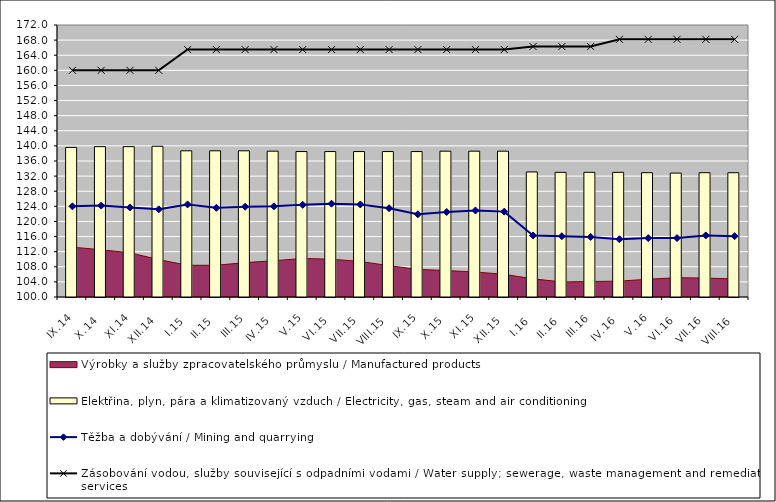
| Category | Elektřina, plyn, pára a klimatizovaný vzduch / Electricity, gas, steam and air conditioning |
|---|---|
| IX.14 | 139.6 |
| X.14 | 139.8 |
| XI.14 | 139.8 |
| XII.14 | 139.9 |
| I.15 | 138.7 |
| II.15 | 138.7 |
| III.15 | 138.7 |
| IV.15 | 138.6 |
| V.15 | 138.5 |
| VI.15 | 138.5 |
| VII.15 | 138.5 |
| VIII.15 | 138.5 |
| IX.15 | 138.5 |
| X.15 | 138.6 |
| XI.15 | 138.6 |
| XII.15 | 138.6 |
| I.16 | 133.1 |
| II.16 | 133 |
| III.16 | 133 |
| IV.16 | 133 |
| V.16 | 132.9 |
| VI.16 | 132.8 |
| VII.16 | 132.9 |
| VIII.16 | 132.9 |